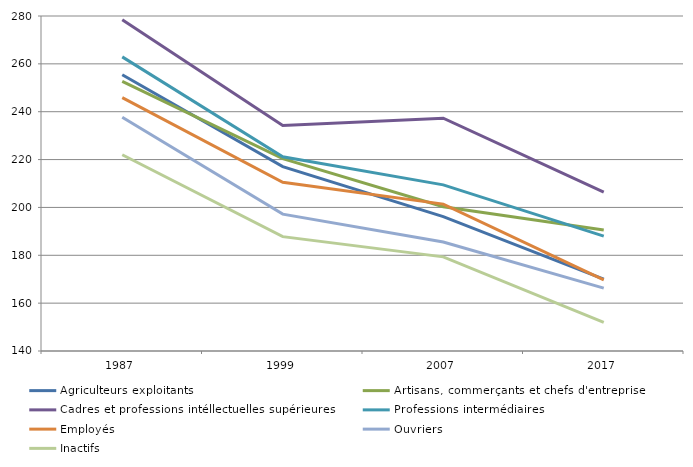
| Category | Agriculteurs exploitants | Artisans, commerçants et chefs d'entreprise | Cadres et professions intéllectuelles supérieures | Professions intermédiaires | Employés | Ouvriers | Inactifs |
|---|---|---|---|---|---|---|---|
| 1987.0 | 255.46 | 252.67 | 278.43 | 262.92 | 245.88 | 237.72 | 222 |
| 1999.0 | 217.08 | 220.39 | 234.23 | 221.16 | 210.5 | 197.19 | 187.78 |
| 2007.0 | 196.17 | 200.26 | 237.31 | 209.44 | 201.38 | 185.54 | 179.35 |
| 2017.0 | 170.03 | 190.57 | 206.35 | 188 | 169.73 | 166.26 | 151.94 |